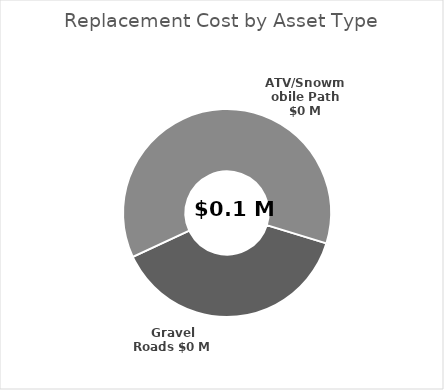
| Category | Series 1 |
|---|---|
| Gravel Roads | 23000 |
| Sidewalks | 0 |
| ATV/Snowmobile Path | 37000 |
| Street Lights | 0 |
| Ditches | 0 |
| Stormwater Ponds | 0 |